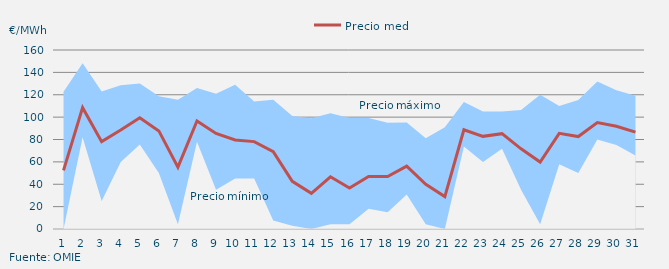
| Category | Precio medio |
|---|---|
| 1.0 | 52.443 |
| 2.0 | 108.472 |
| 3.0 | 78.079 |
| 4.0 | 88.4 |
| 5.0 | 99.454 |
| 6.0 | 87.671 |
| 7.0 | 55.277 |
| 8.0 | 96.491 |
| 9.0 | 85.452 |
| 10.0 | 79.584 |
| 11.0 | 78.113 |
| 12.0 | 69.144 |
| 13.0 | 42.563 |
| 14.0 | 31.932 |
| 15.0 | 46.633 |
| 16.0 | 36.669 |
| 17.0 | 46.906 |
| 18.0 | 46.952 |
| 19.0 | 56.155 |
| 20.0 | 40.016 |
| 21.0 | 29.009 |
| 22.0 | 88.683 |
| 23.0 | 82.813 |
| 24.0 | 85.214 |
| 25.0 | 71.651 |
| 26.0 | 59.838 |
| 27.0 | 85.483 |
| 28.0 | 82.644 |
| 29.0 | 95.173 |
| 30.0 | 91.877 |
| 31.0 | 86.572 |